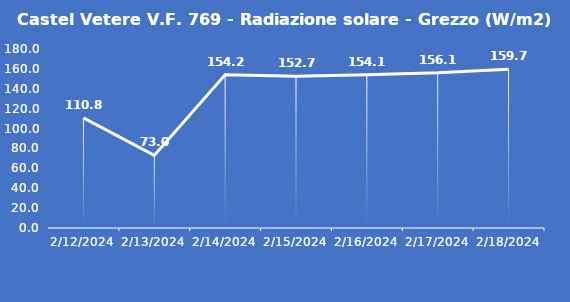
| Category | Castel Vetere V.F. 769 - Radiazione solare - Grezzo (W/m2) |
|---|---|
| 2/12/24 | 110.8 |
| 2/13/24 | 73 |
| 2/14/24 | 154.2 |
| 2/15/24 | 152.7 |
| 2/16/24 | 154.1 |
| 2/17/24 | 156.1 |
| 2/18/24 | 159.7 |